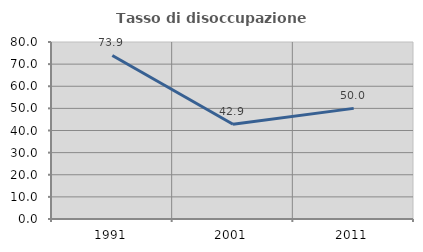
| Category | Tasso di disoccupazione giovanile  |
|---|---|
| 1991.0 | 73.913 |
| 2001.0 | 42.857 |
| 2011.0 | 50 |